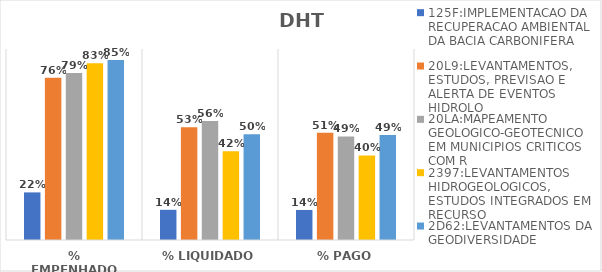
| Category | 125F:IMPLEMENTACAO DA RECUPERACAO AMBIENTAL DA BACIA CARBONIFERA | 20L9:LEVANTAMENTOS, ESTUDOS, PREVISAO E ALERTA DE EVENTOS HIDROLO | 20LA:MAPEAMENTO GEOLOGICO-GEOTECNICO EM MUNICIPIOS CRITICOS COM R | 2397:LEVANTAMENTOS HIDROGEOLOGICOS, ESTUDOS INTEGRADOS EM RECURSO | 2D62:LEVANTAMENTOS DA GEODIVERSIDADE |
|---|---|---|---|---|---|
| % EMPENHADO | 0.224 | 0.765 | 0.787 | 0.833 | 0.848 |
| % LIQUIDADO | 0.142 | 0.531 | 0.56 | 0.418 | 0.498 |
| % PAGO | 0.142 | 0.506 | 0.488 | 0.398 | 0.495 |